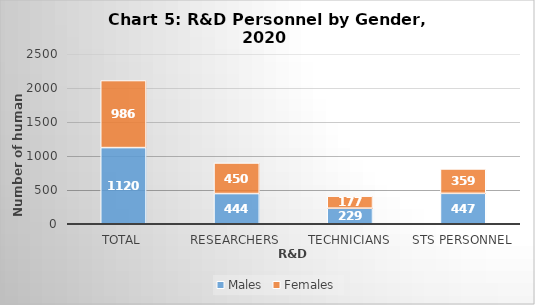
| Category | Males | Females |
|---|---|---|
| Total | 1120 | 986 |
| Researchers | 444 | 450 |
| Technicians | 229 | 177 |
| STS Personnel | 447 | 359 |